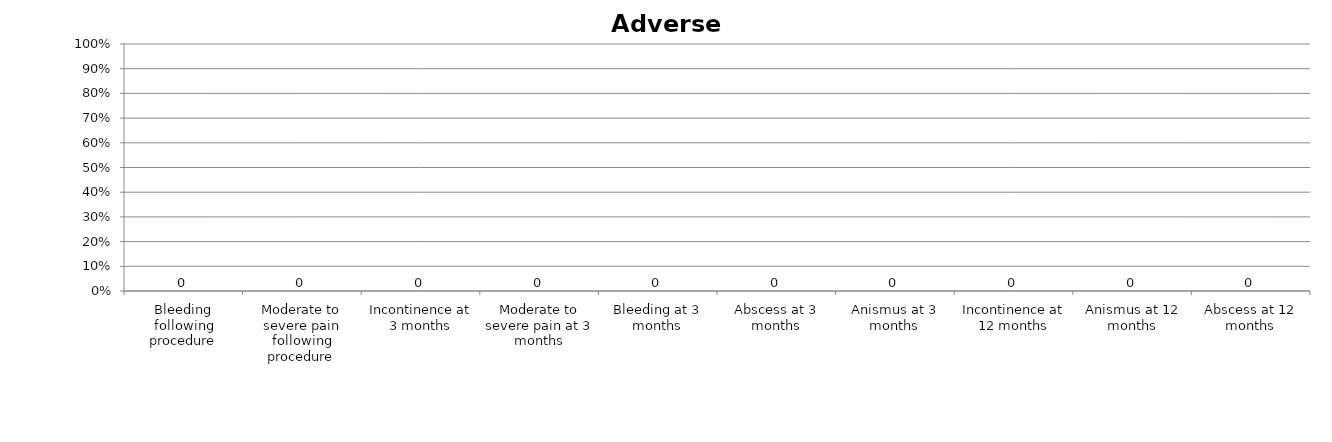
| Category | Series 0 |
|---|---|
| Bleeding following procedure | 0 |
| Moderate to severe pain following procedure | 0 |
| Incontinence at 3 months | 0 |
| Moderate to severe pain at 3 months | 0 |
| Bleeding at 3 months | 0 |
| Abscess at 3 months | 0 |
| Anismus at 3 months | 0 |
| Incontinence at 12 months | 0 |
| Anismus at 12 months | 0 |
| Abscess at 12 months | 0 |